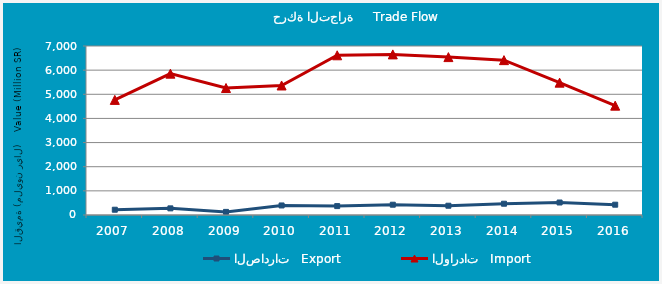
| Category | الصادرات   Export | الواردات   Import |
|---|---|---|
| 2007.0 | 218.729 | 4768.341 |
| 2008.0 | 274.741 | 5853.9 |
| 2009.0 | 128.35 | 5260.864 |
| 2010.0 | 395.138 | 5364.956 |
| 2011.0 | 368.855 | 6615.424 |
| 2012.0 | 426.309 | 6652.091 |
| 2013.0 | 384.369 | 6540.059 |
| 2014.0 | 467.042 | 6414.787 |
| 2015.0 | 517.157 | 5481.469 |
| 2016.0 | 426.69 | 4528.799 |